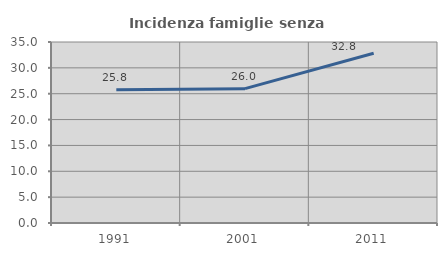
| Category | Incidenza famiglie senza nuclei |
|---|---|
| 1991.0 | 25.756 |
| 2001.0 | 25.98 |
| 2011.0 | 32.821 |